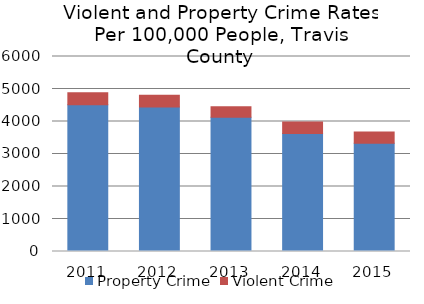
| Category | Property Crime | Violent Crime |
|---|---|---|
| 2011.0 | 4515.644 | 369.755 |
| 2012.0 | 4445.187 | 361.214 |
| 2013.0 | 4128.367 | 325.32 |
| 2014.0 | 3630.894 | 357.424 |
| 2015.0 | 3329.093 | 347.522 |